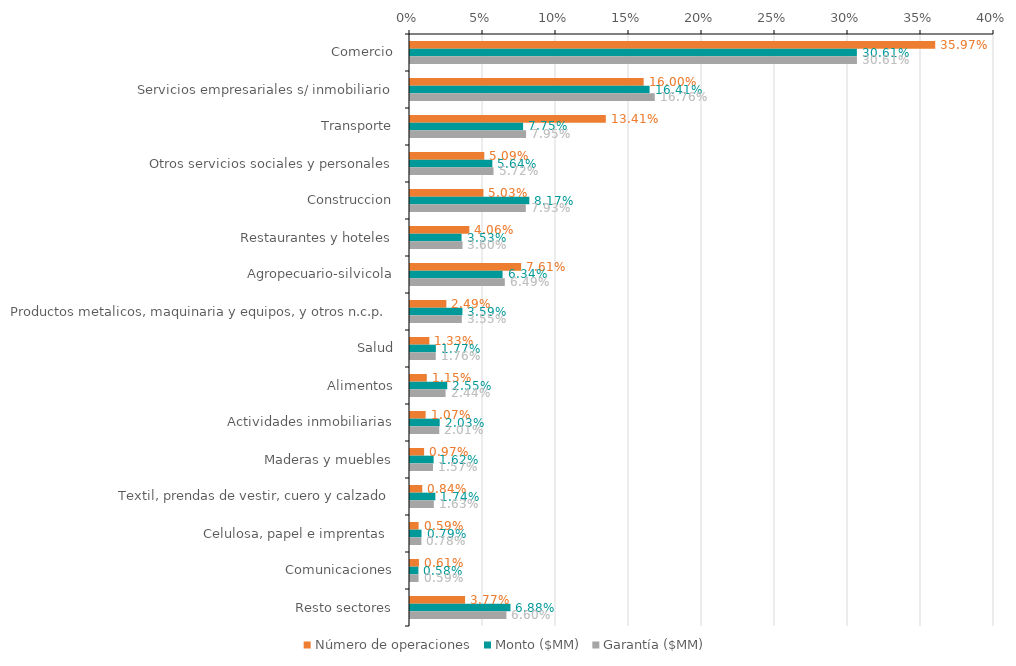
| Category | Número de operaciones | Monto ($MM) | Garantía ($MM) |
|---|---|---|---|
| Comercio | 0.36 | 0.306 | 0.306 |
| Servicios empresariales s/ inmobiliario | 0.16 | 0.164 | 0.168 |
| Transporte | 0.134 | 0.077 | 0.08 |
| Otros servicios sociales y personales | 0.051 | 0.056 | 0.057 |
| Construccion | 0.05 | 0.082 | 0.079 |
| Restaurantes y hoteles | 0.041 | 0.035 | 0.036 |
| Agropecuario-silvicola | 0.076 | 0.063 | 0.065 |
| Productos metalicos, maquinaria y equipos, y otros n.c.p. | 0.025 | 0.036 | 0.036 |
| Salud | 0.013 | 0.018 | 0.018 |
| Alimentos | 0.012 | 0.026 | 0.024 |
| Actividades inmobiliarias | 0.011 | 0.02 | 0.02 |
| Maderas y muebles | 0.01 | 0.016 | 0.016 |
| Textil, prendas de vestir, cuero y calzado | 0.008 | 0.017 | 0.016 |
| Celulosa, papel e imprentas  | 0.006 | 0.008 | 0.008 |
| Comunicaciones | 0.006 | 0.006 | 0.006 |
| Resto sectores | 0.038 | 0.069 | 0.066 |